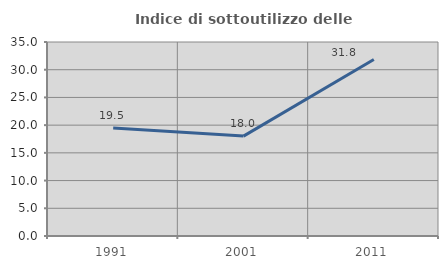
| Category | Indice di sottoutilizzo delle abitazioni  |
|---|---|
| 1991.0 | 19.487 |
| 2001.0 | 18.023 |
| 2011.0 | 31.847 |